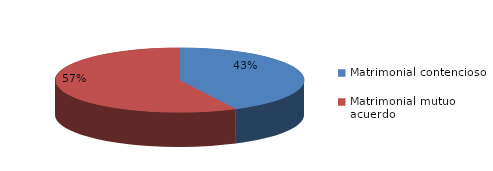
| Category | Series 0 |
|---|---|
| 0 | 314 |
| 1 | 423 |